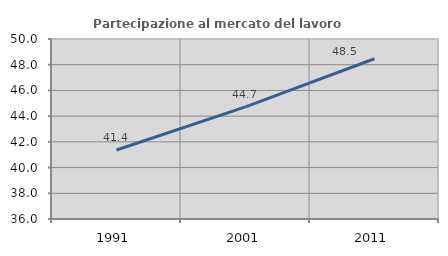
| Category | Partecipazione al mercato del lavoro  femminile |
|---|---|
| 1991.0 | 41.367 |
| 2001.0 | 44.722 |
| 2011.0 | 48.465 |